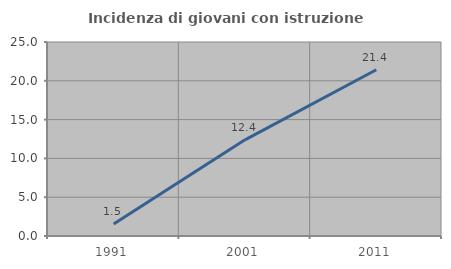
| Category | Incidenza di giovani con istruzione universitaria |
|---|---|
| 1991.0 | 1.546 |
| 2001.0 | 12.389 |
| 2011.0 | 21.429 |